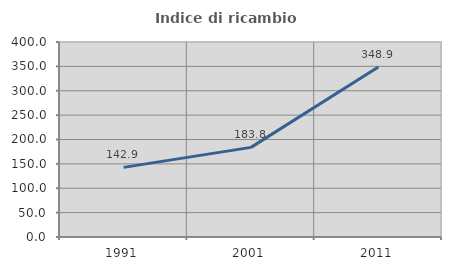
| Category | Indice di ricambio occupazionale  |
|---|---|
| 1991.0 | 142.857 |
| 2001.0 | 183.824 |
| 2011.0 | 348.936 |